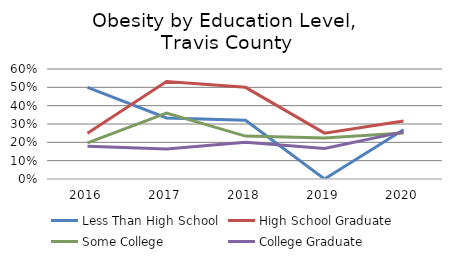
| Category | Less Than High School | High School Graduate | Some College | College Graduate |
|---|---|---|---|---|
| 2016.0 | 0.5 | 0.249 | 0.197 | 0.178 |
| 2017.0 | 0.333 | 0.532 | 0.36 | 0.164 |
| 2018.0 | 0.32 | 0.5 | 0.234 | 0.201 |
| 2019.0 | 0 | 0.25 | 0.224 | 0.166 |
| 2020.0 | 0.269 | 0.316 | 0.251 | 0.257 |